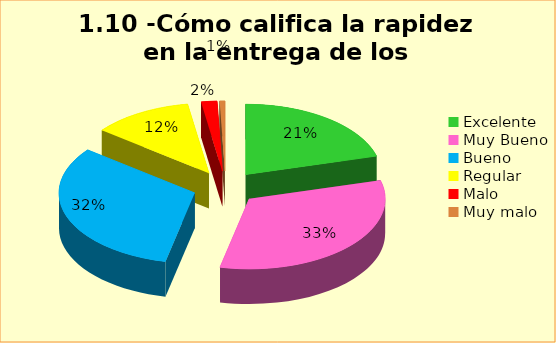
| Category | Series 0 |
|---|---|
| Excelente | 0.208 |
| Muy Bueno | 0.327 |
| Bueno  | 0.321 |
| Regular  | 0.119 |
| Malo  | 0.019 |
| Muy malo  | 0.006 |